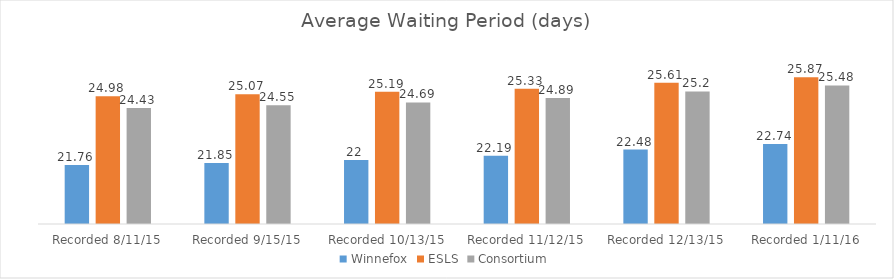
| Category | Winnefox | ESLS | Consortium |
|---|---|---|---|
| Recorded 8/11/15 | 21.76 | 24.98 | 24.43 |
| Recorded 9/15/15 | 21.85 | 25.07 | 24.55 |
| Recorded 10/13/15 | 22 | 25.19 | 24.69 |
| Recorded 11/12/15 | 22.19 | 25.33 | 24.89 |
| Recorded 12/13/15 | 22.48 | 25.61 | 25.2 |
| Recorded 1/11/16 | 22.74 | 25.87 | 25.48 |